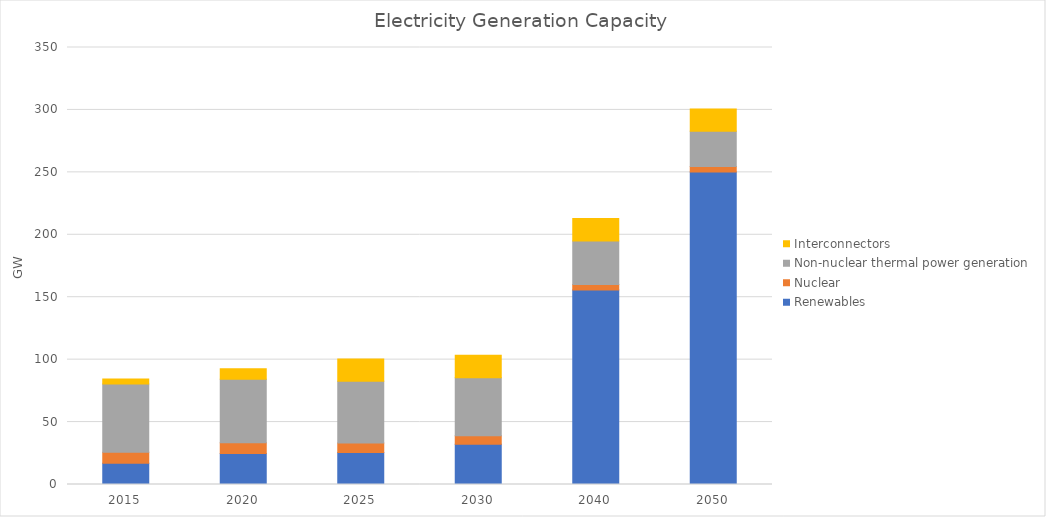
| Category | Renewables | Nuclear | Non-nuclear thermal power generation | Interconnectors |
|---|---|---|---|---|
| 2015.0 | 16.997 | 8.741 | 54.767 | 4 |
| 2020.0 | 24.755 | 8.741 | 50.86 | 8.4 |
| 2025.0 | 25.61 | 7.681 | 49.352 | 17.9 |
| 2030.0 | 32.156 | 6.801 | 46.567 | 17.9 |
| 2040.0 | 155.865 | 4.391 | 34.789 | 17.9 |
| 2050.0 | 250.259 | 4.39 | 28.24 | 17.9 |